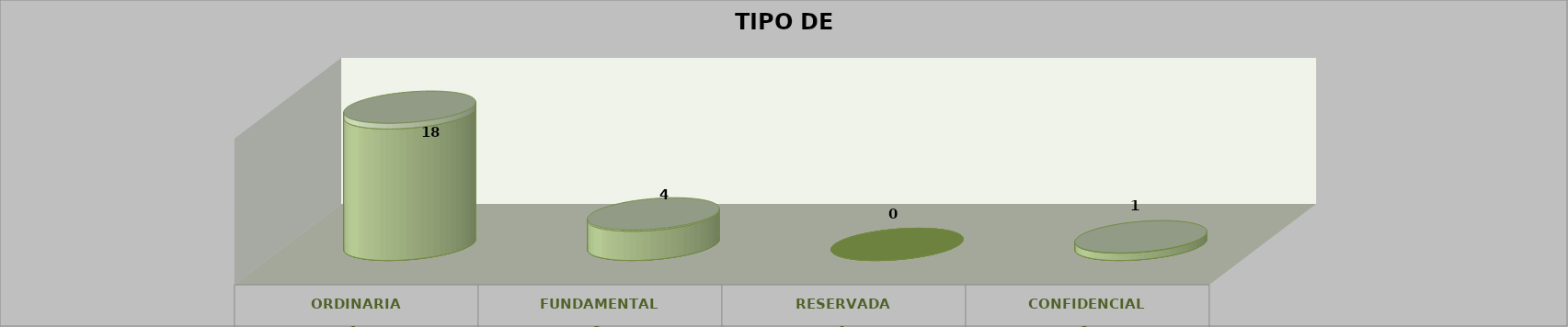
| Category | Series 0 | Series 2 | Series 1 | Series 3 | Series 4 |
|---|---|---|---|---|---|
| 0 |  |  |  | 18 | 0.783 |
| 1 |  |  |  | 4 | 0.174 |
| 2 |  |  |  | 0 | 0 |
| 3 |  |  |  | 1 | 0.043 |